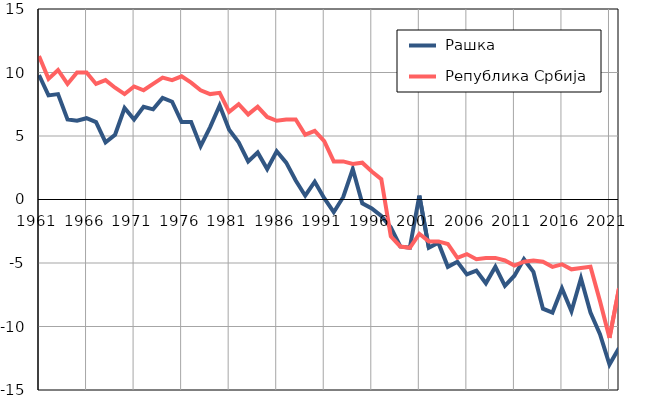
| Category |  Рашка |  Република Србија |
|---|---|---|
| 1961.0 | 9.8 | 11.3 |
| 1962.0 | 8.2 | 9.5 |
| 1963.0 | 8.3 | 10.2 |
| 1964.0 | 6.3 | 9.1 |
| 1965.0 | 6.2 | 10 |
| 1966.0 | 6.4 | 10 |
| 1967.0 | 6.1 | 9.1 |
| 1968.0 | 4.5 | 9.4 |
| 1969.0 | 5.1 | 8.8 |
| 1970.0 | 7.2 | 8.3 |
| 1971.0 | 6.3 | 8.9 |
| 1972.0 | 7.3 | 8.6 |
| 1973.0 | 7.1 | 9.1 |
| 1974.0 | 8 | 9.6 |
| 1975.0 | 7.7 | 9.4 |
| 1976.0 | 6.1 | 9.7 |
| 1977.0 | 6.1 | 9.2 |
| 1978.0 | 4.2 | 8.6 |
| 1979.0 | 5.7 | 8.3 |
| 1980.0 | 7.4 | 8.4 |
| 1981.0 | 5.5 | 6.9 |
| 1982.0 | 4.5 | 7.5 |
| 1983.0 | 3 | 6.7 |
| 1984.0 | 3.7 | 7.3 |
| 1985.0 | 2.4 | 6.5 |
| 1986.0 | 3.8 | 6.2 |
| 1987.0 | 2.9 | 6.3 |
| 1988.0 | 1.5 | 6.3 |
| 1989.0 | 0.3 | 5.1 |
| 1990.0 | 1.4 | 5.4 |
| 1991.0 | 0.1 | 4.6 |
| 1992.0 | -1 | 3 |
| 1993.0 | 0.2 | 3 |
| 1994.0 | 2.4 | 2.8 |
| 1995.0 | -0.3 | 2.9 |
| 1996.0 | -0.7 | 2.2 |
| 1997.0 | -1.3 | 1.6 |
| 1998.0 | -2.2 | -2.9 |
| 1999.0 | -3.7 | -3.7 |
| 2000.0 | -3.8 | -3.8 |
| 2001.0 | 0.3 | -2.7 |
| 2002.0 | -3.8 | -3.3 |
| 2003.0 | -3.4 | -3.3 |
| 2004.0 | -5.3 | -3.5 |
| 2005.0 | -4.9 | -4.6 |
| 2006.0 | -5.9 | -4.3 |
| 2007.0 | -5.6 | -4.7 |
| 2008.0 | -6.6 | -4.6 |
| 2009.0 | -5.3 | -4.6 |
| 2010.0 | -6.8 | -4.8 |
| 2011.0 | -6 | -5.2 |
| 2012.0 | -4.7 | -4.9 |
| 2013.0 | -5.7 | -4.8 |
| 2014.0 | -8.6 | -4.9 |
| 2015.0 | -8.9 | -5.3 |
| 2016.0 | -7 | -5.1 |
| 2017.0 | -8.8 | -5.5 |
| 2018.0 | -6.2 | -5.4 |
| 2019.0 | -8.9 | -5.3 |
| 2020.0 | -10.6 | -8 |
| 2021.0 | -13 | -10.9 |
| 2022.0 | -11.7 | -7 |